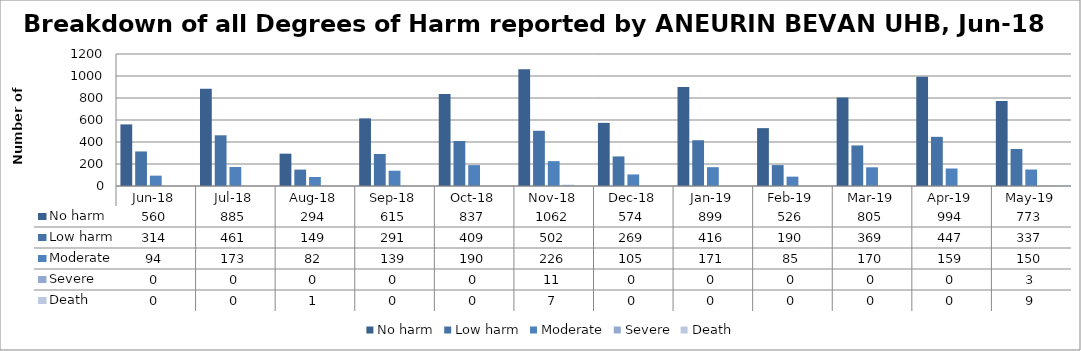
| Category | No harm | Low harm | Moderate | Severe | Death |
|---|---|---|---|---|---|
| Jun-18 | 560 | 314 | 94 | 0 | 0 |
| Jul-18 | 885 | 461 | 173 | 0 | 0 |
| Aug-18 | 294 | 149 | 82 | 0 | 1 |
| Sep-18 | 615 | 291 | 139 | 0 | 0 |
| Oct-18 | 837 | 409 | 190 | 0 | 0 |
| Nov-18 | 1062 | 502 | 226 | 11 | 7 |
| Dec-18 | 574 | 269 | 105 | 0 | 0 |
| Jan-19 | 899 | 416 | 171 | 0 | 0 |
| Feb-19 | 526 | 190 | 85 | 0 | 0 |
| Mar-19 | 805 | 369 | 170 | 0 | 0 |
| Apr-19 | 994 | 447 | 159 | 0 | 0 |
| May-19 | 773 | 337 | 150 | 3 | 9 |